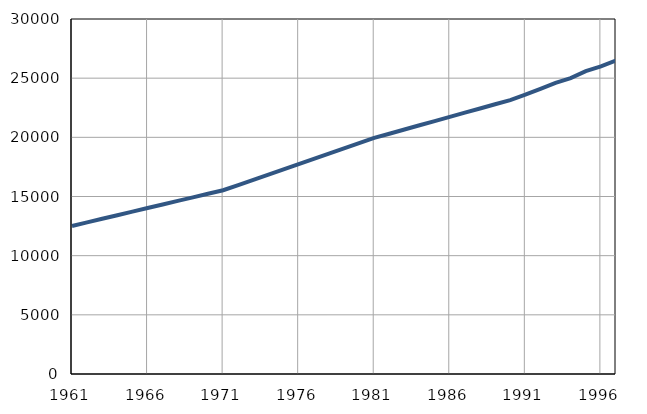
| Category | Број
становника |
|---|---|
| 1961.0 | 12513 |
| 1962.0 | 12815 |
| 1963.0 | 13117 |
| 1964.0 | 13419 |
| 1965.0 | 13721 |
| 1966.0 | 14023 |
| 1967.0 | 14325 |
| 1968.0 | 14627 |
| 1969.0 | 14929 |
| 1970.0 | 15231 |
| 1971.0 | 15528 |
| 1972.0 | 15970 |
| 1973.0 | 16412 |
| 1974.0 | 16854 |
| 1975.0 | 17296 |
| 1976.0 | 17738 |
| 1977.0 | 18180 |
| 1978.0 | 18622 |
| 1979.0 | 19064 |
| 1980.0 | 19506 |
| 1981.0 | 19952 |
| 1982.0 | 20307 |
| 1983.0 | 20662 |
| 1984.0 | 21017 |
| 1985.0 | 21372 |
| 1986.0 | 21727 |
| 1987.0 | 22082 |
| 1988.0 | 22437 |
| 1989.0 | 22792 |
| 1990.0 | 23147 |
| 1991.0 | 23600 |
| 1992.0 | 24100 |
| 1993.0 | 24600 |
| 1994.0 | 25000 |
| 1995.0 | 25600 |
| 1996.0 | 26000 |
| 1997.0 | 26500 |